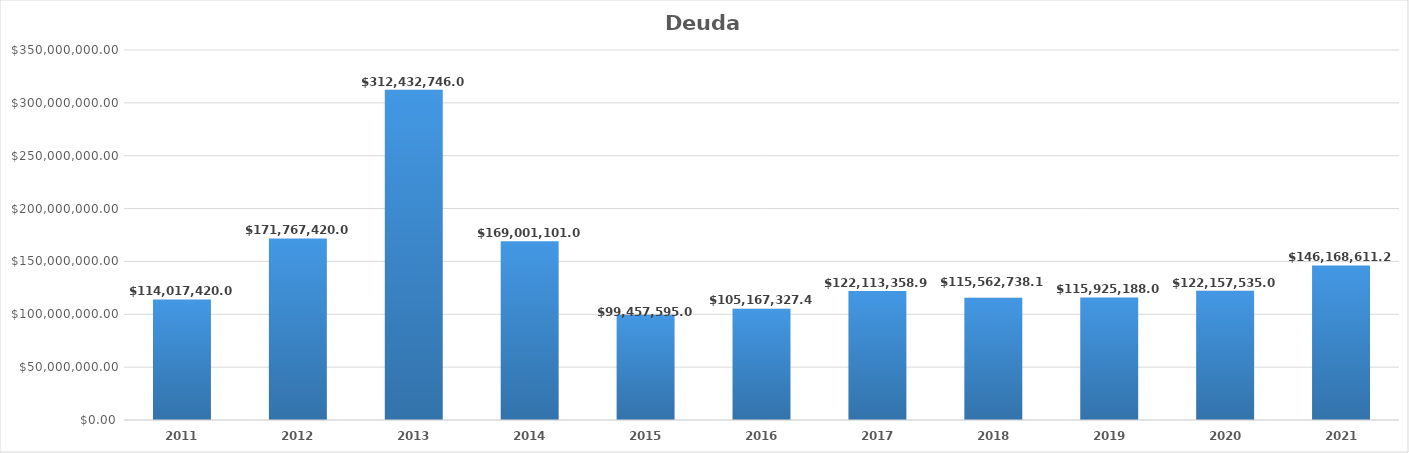
| Category | Deuda Pública |
|---|---|
| 2011.0 | 114017420 |
| 2012.0 | 171767420 |
| 2013.0 | 312432746 |
| 2014.0 | 169001101 |
| 2015.0 | 99457595 |
| 2016.0 | 105167327.47 |
| 2017.0 | 122113358.96 |
| 2018.0 | 115562738.17 |
| 2019.0 | 115925188 |
| 2020.0 | 122157535 |
| 2021.0 | 146168611.25 |